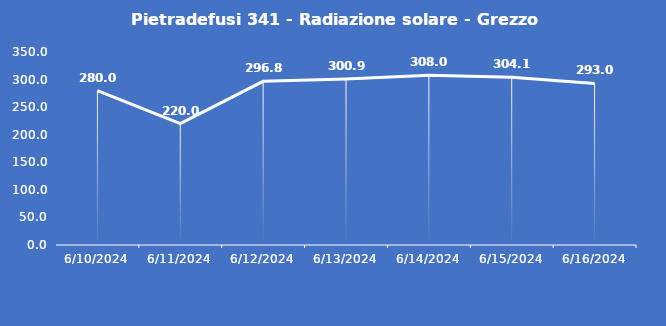
| Category | Pietradefusi 341 - Radiazione solare - Grezzo (W/m2) |
|---|---|
| 6/10/24 | 280 |
| 6/11/24 | 220 |
| 6/12/24 | 296.8 |
| 6/13/24 | 300.9 |
| 6/14/24 | 308 |
| 6/15/24 | 304.1 |
| 6/16/24 | 293 |